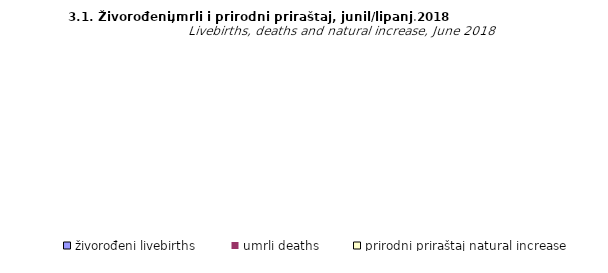
| Category | živorođeni livebirths | umrli deaths | prirodni priraštaj natural increase |
|---|---|---|---|
| Unsko - sanski | 132 | 165 | -33 |
| Kanton Posavski | 14 | 36 | -22 |
| Tuzlanski | 274 | 304 | -30 |
| Zeničko - dobojski | 281 | 239 | 42 |
| Bosansko - podrinjski | 30 | 25 | 5 |
| Srednjobosanski | 162 | 162 | 0 |
| Hercegovačko-
neretvanski | 145 | 157 | -12 |
| Zapadnohercegovački | 67 | 69 | -2 |
| Kanton Sarajevo | 368 | 298 | 70 |
| Kanton 10 | 29 | 54 | -25 |